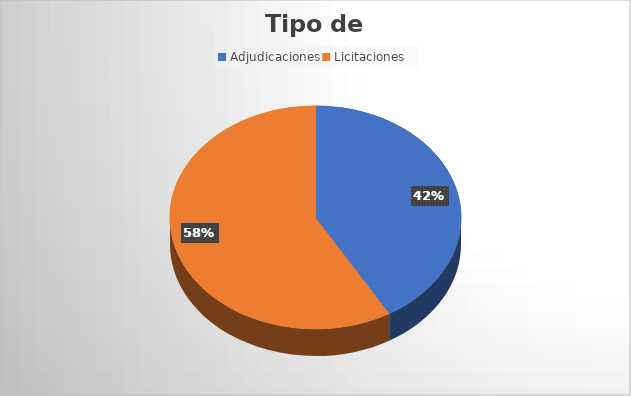
| Category | Monto |
|---|---|
| Adjudicaciones | 33302603.04 |
| Licitaciones  | 46864959.28 |